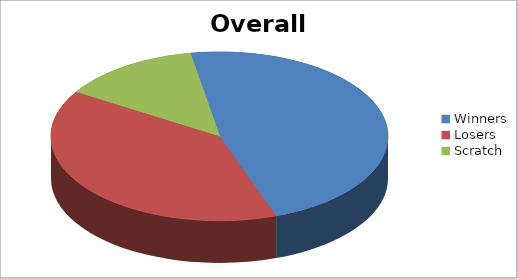
| Category | Series 1 |
|---|---|
| Winners | 53 |
| Losers | 44 |
| Scratch | 15 |